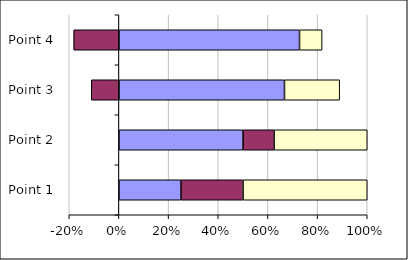
| Category | Series 1 | Series 2 | Series 3 |
|---|---|---|---|
| Point 1 | 2 | 2 | 4 |
| Point 2 | 4 | 1 | 3 |
| Point 3 | 6 | -1 | 2 |
| Point 4 | 8 | -2 | 1 |